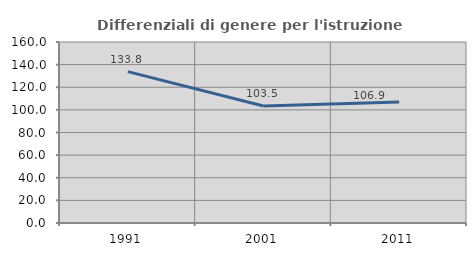
| Category | Differenziali di genere per l'istruzione superiore |
|---|---|
| 1991.0 | 133.8 |
| 2001.0 | 103.49 |
| 2011.0 | 106.924 |